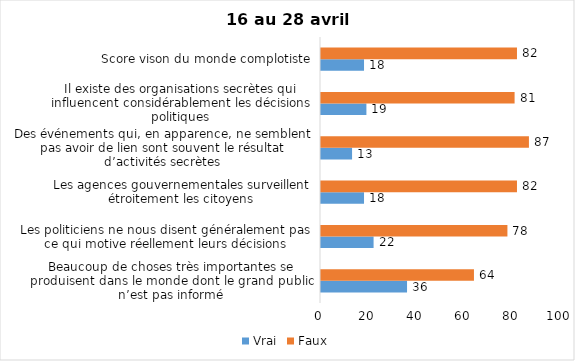
| Category | Vrai | Faux |
|---|---|---|
| Beaucoup de choses très importantes se produisent dans le monde dont le grand public n’est pas informé | 36 | 64 |
| Les politiciens ne nous disent généralement pas ce qui motive réellement leurs décisions | 22 | 78 |
| Les agences gouvernementales surveillent étroitement les citoyens | 18 | 82 |
| Des événements qui, en apparence, ne semblent pas avoir de lien sont souvent le résultat d’activités secrètes | 13 | 87 |
| Il existe des organisations secrètes qui influencent considérablement les décisions politiques | 19 | 81 |
| Score vison du monde complotiste | 18 | 82 |